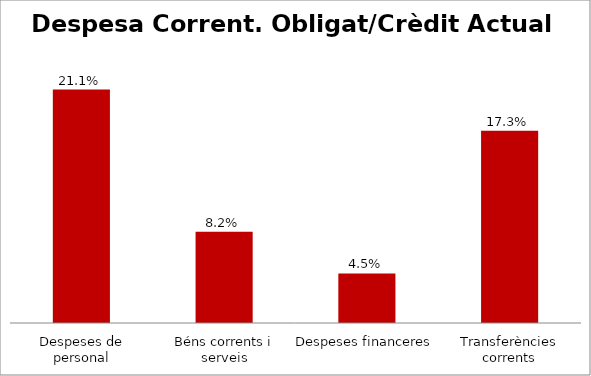
| Category | Series 0 |
|---|---|
| Despeses de personal | 0.211 |
| Béns corrents i serveis | 0.082 |
| Despeses financeres | 0.045 |
| Transferències corrents | 0.173 |